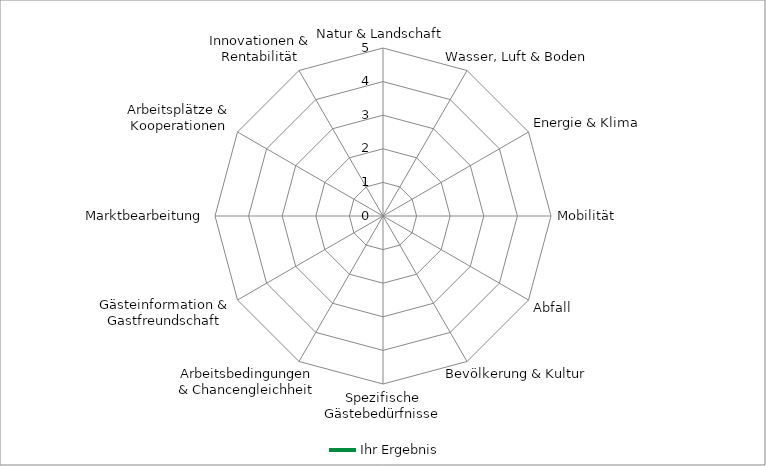
| Category | Ihr Ergebnis |
|---|---|
| Natur & Landschaft | 0 |
| Wasser, Luft & Boden | 0 |
| Energie & Klima | 0 |
| Mobilität | 0 |
| Abfall | 0 |
| Bevölkerung & Kultur | 0 |
| Spezifische Gästebedürfnisse | 0 |
| Arbeitsbedingungen & Chancengleichheit | 0 |
| Gästeinformation & Gastfreundschaft | 0 |
| Marktbearbeitung | 0 |
| Arbeitsplätze & Kooperationen | 0 |
| Innovationen & Rentabilität | 0 |